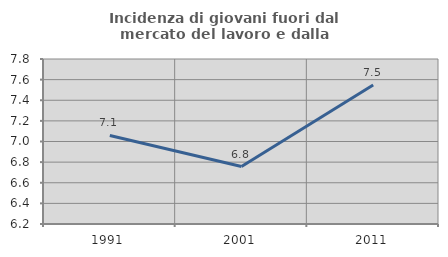
| Category | Incidenza di giovani fuori dal mercato del lavoro e dalla formazione  |
|---|---|
| 1991.0 | 7.059 |
| 2001.0 | 6.757 |
| 2011.0 | 7.547 |